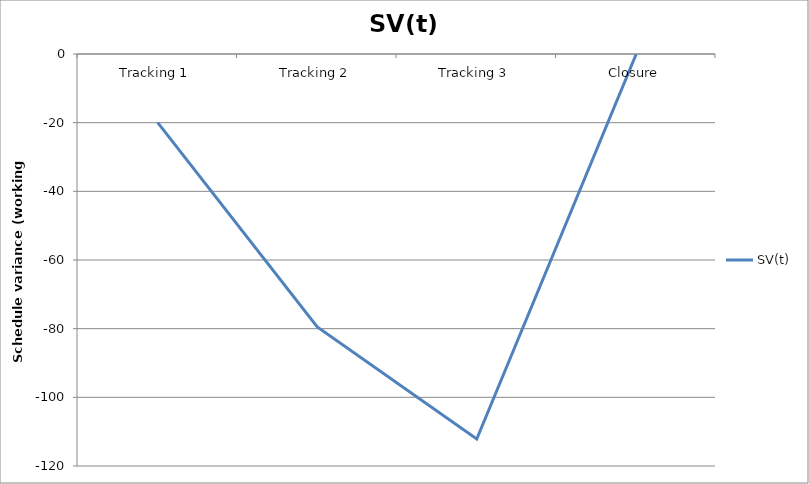
| Category | SV(t) |
|---|---|
| Tracking 1 | -20 |
| Tracking 2 | -79.5 |
| Tracking 3 | -112.125 |
| Closure | 0 |